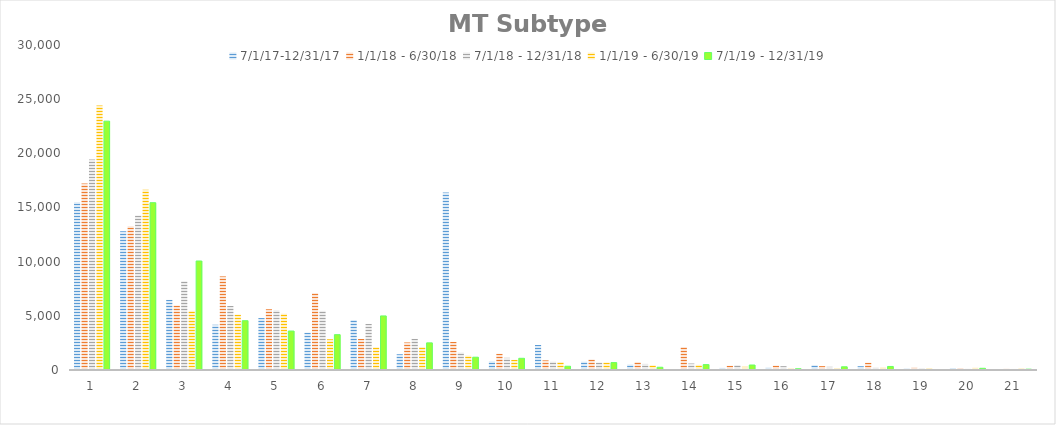
| Category | 7/1/17-12/31/17 | 1/1/18 - 6/30/18 | 7/1/18 - 12/31/18 | 1/1/19 - 6/30/19 | 7/1/19 - 12/31/19 |
|---|---|---|---|---|---|
| 1 | 15477 | 17215 | 19422 | 24408 | 22969 |
| 2 | 12810 | 13262 | 14270 | 16636 | 15447 |
| 3 | 6472 | 5955 | 8188 | 5463 | 10062 |
| 4 | 4178 | 8641 | 5907 | 5119 | 4550 |
| 5 | 4794 | 5606 | 5514 | 5198 | 3596 |
| 6 | 3449 | 7093 | 5464 | 2836 | 3262 |
| 7 | 4615 | 2864 | 4252 | 2104 | 4991 |
| 8 | 1454 | 2543 | 2871 | 2118 | 2504 |
| 9 | 16374 | 2593 | 1612 | 1328 | 1180 |
| 10 | 805 | 1498 | 1125 | 936 | 1079 |
| 11 | 2307 | 888 | 767 | 735 | 346 |
| 12 | 771 | 969 | 687 | 702 | 685 |
| 13 | 505 | 730 | 559 | 441 | 254 |
| 14 | 93 | 2119 | 600 | 477 | 498 |
| 15 | 201 | 393 | 453 | 296 | 461 |
| 16 | 235 | 408 | 353 | 164 | 114 |
| 17 | 448 | 356 | 294 | 186 | 297 |
| 18 | 350 | 677 | 235 | 246 | 327 |
| 19 | 143 | 254 | 160 | 187 | 32 |
| 20 | 184 | 176 | 112 | 217 | 157 |
| 21 | 60 | 118 | 98 | 163 | 76 |